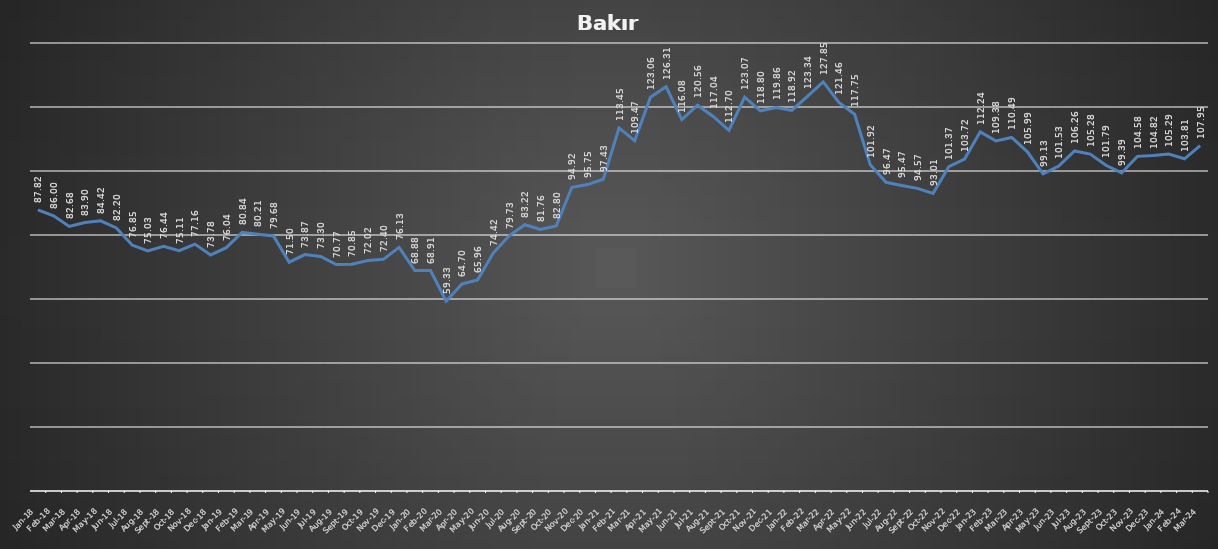
| Category | Series 0 |
|---|---|
| 2018-01-31 | 87.823 |
| 2018-02-28 | 85.999 |
| 2018-03-31 | 82.684 |
| 2018-04-30 | 83.896 |
| 2018-05-31 | 84.416 |
| 2018-06-30 | 82.202 |
| 2018-07-31 | 76.846 |
| 2018-08-31 | 75.034 |
| 2018-09-30 | 76.438 |
| 2018-10-31 | 75.114 |
| 2018-11-30 | 77.155 |
| 2018-12-31 | 73.779 |
| 2019-01-31 | 76.042 |
| 2019-02-28 | 80.841 |
| 2019-03-31 | 80.21 |
| 2019-04-30 | 79.678 |
| 2019-05-31 | 71.497 |
| 2019-06-30 | 73.865 |
| 2019-07-31 | 73.296 |
| 2019-08-31 | 70.773 |
| 2019-09-30 | 70.847 |
| 2019-10-31 | 72.022 |
| 2019-11-30 | 72.4 |
| 2019-12-31 | 76.135 |
| 2020-01-31 | 68.881 |
| 2020-02-29 | 68.905 |
| 2020-03-31 | 59.332 |
| 2020-04-30 | 64.7 |
| 2020-05-31 | 65.955 |
| 2020-06-30 | 74.416 |
| 2020-07-31 | 79.734 |
| 2020-08-31 | 83.216 |
| 2020-09-30 | 81.756 |
| 2020-10-31 | 82.801 |
| 2020-11-30 | 94.923 |
| 2020-12-31 | 95.751 |
| 2021-01-31 | 97.427 |
| 2021-02-28 | 113.451 |
| 2021-03-31 | 109.468 |
| 2021-04-30 | 123.055 |
| 2021-05-31 | 126.314 |
| 2021-06-30 | 116.079 |
| 2021-07-31 | 120.563 |
| 2021-08-31 | 117.038 |
| 2021-09-30 | 112.703 |
| 2021-10-31 | 123.067 |
| 2021-11-30 | 118.8 |
| 2021-12-31 | 119.864 |
| 2022-01-31 | 118.924 |
| 2022-02-28 | 123.34 |
| 2022-03-31 | 127.848 |
| 2022-04-30 | 121.459 |
| 2022-05-31 | 117.749 |
| 2022-06-30 | 101.917 |
| 2022-07-31 | 96.475 |
| 2022-08-31 | 95.473 |
| 2022-09-30 | 94.57 |
| 2022-10-31 | 93.012 |
| 2022-11-30 | 101.373 |
| 2022-12-31 | 103.723 |
| 2023-01-31 | 112.239 |
| 2023-02-28 | 109.375 |
| 2023-03-31 | 110.489 |
| 2023-04-30 | 105.986 |
| 2023-05-31 | 99.134 |
| 2023-06-30 | 101.534 |
| 2023-07-31 | 106.259 |
| 2023-08-31 | 105.281 |
| 2023-09-30 | 101.793 |
| 2023-10-31 | 99.394 |
| 2023-11-30 | 104.576 |
| 2023-12-31 | 104.824 |
| 2024-01-31 | 105.288 |
| 2024-02-29 | 103.81 |
| 2024-03-31 | 107.953 |